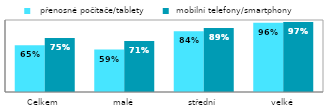
| Category |   přenosné počítače/tablety |  mobilní telefony/smartphony  |
|---|---|---|
| Celkem | 0.648 | 0.751 |
| malé | 0.589 | 0.71 |
| střední | 0.843 | 0.889 |
| velké | 0.961 | 0.973 |